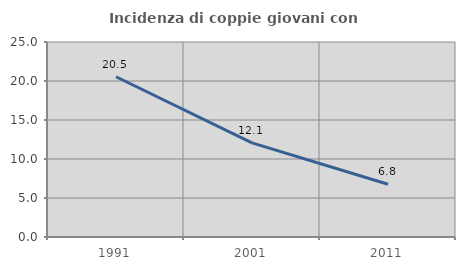
| Category | Incidenza di coppie giovani con figli |
|---|---|
| 1991.0 | 20.548 |
| 2001.0 | 12.061 |
| 2011.0 | 6.757 |